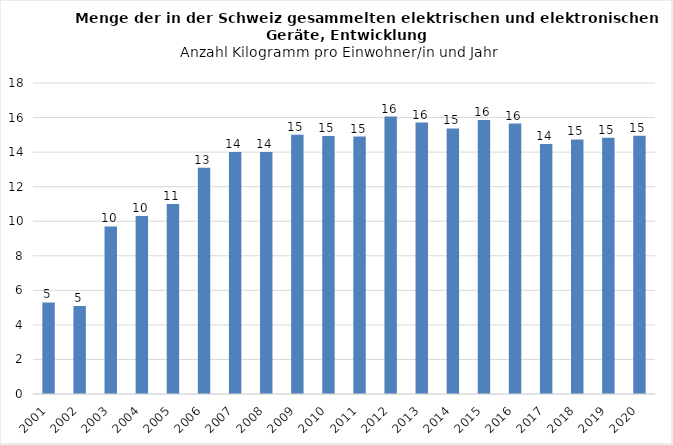
| Category | Series 0 |
|---|---|
| 2001.0 | 5.3 |
| 2002.0 | 5.1 |
| 2003.0 | 9.7 |
| 2004.0 | 10.3 |
| 2005.0 | 11 |
| 2006.0 | 13.1 |
| 2007.0 | 14 |
| 2008.0 | 14 |
| 2009.0 | 15 |
| 2010.0 | 14.929 |
| 2011.0 | 14.897 |
| 2012.0 | 16.059 |
| 2013.0 | 15.713 |
| 2014.0 | 15.368 |
| 2015.0 | 15.864 |
| 2016.0 | 15.654 |
| 2017.0 | 14.474 |
| 2018.0 | 14.735 |
| 2019.0 | 14.827 |
| 2020.0 | 14.952 |